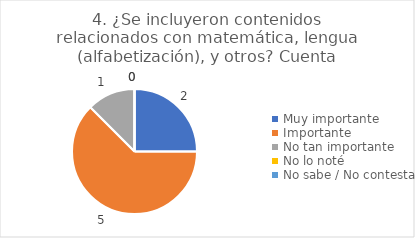
| Category | 4. ¿Se incluyeron contenidos relacionados con matemática, lengua (alfabetización), y otros? |
|---|---|
| Muy importante  | 0.25 |
| Importante  | 0.625 |
| No tan importante  | 0.125 |
| No lo noté  | 0 |
| No sabe / No contesta | 0 |